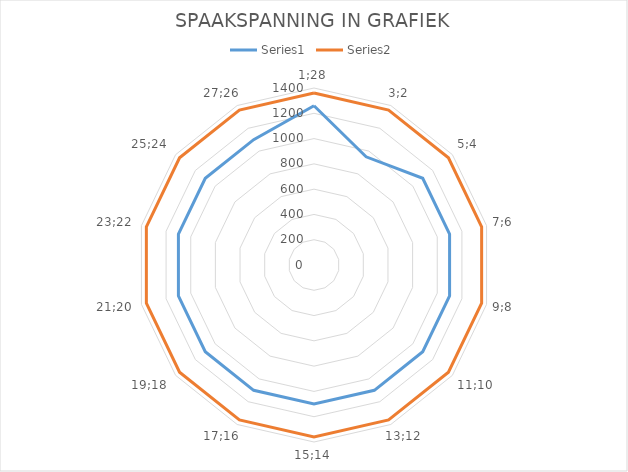
| Category | Series 0 | Series 1 |
|---|---|---|
| 1;28 | 1260 | 1360 |
| 3;2 | 950 | 1360 |
| 5;4 | 1100 | 1360 |
| 7;6 | 1100 | 1360 |
| 9;8 | 1100 | 1360 |
| 11;10 | 1100 | 1360 |
| 13;12 | 1100 | 1360 |
| 15;14 | 1100 | 1360 |
| 17;16 | 1100 | 1360 |
| 19;18 | 1100 | 1360 |
| 21;20 | 1100 | 1360 |
| 23;22 | 1100 | 1360 |
| 25;24 | 1100 | 1360 |
| 27;26 | 1100 | 1360 |